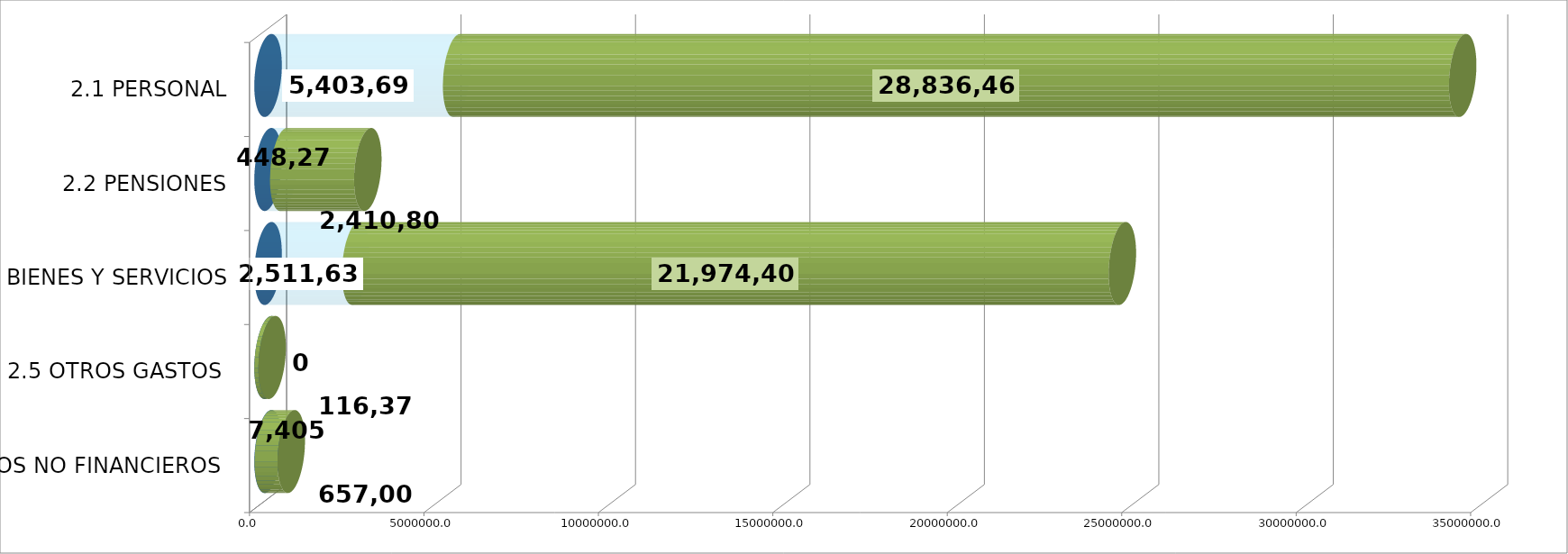
| Category | GENERICA | EJECUTADO | SALDO  |
|---|---|---|---|
| 2.1 PERSONAL | 0 | 5403694.45 | 28836468.55 |
| 2.2 PENSIONES | 0 | 448275.03 | 2410802.97 |
| 2.3 BIENES Y SERVICIOS | 0 | 2511633.89 | 21974401.11 |
| 2.5 OTROS GASTOS  | 0 | 0 | 116374 |
| 2.6 ACTIVOS NO FINANCIEROS  | 0 | 7404.68 | 657005.32 |